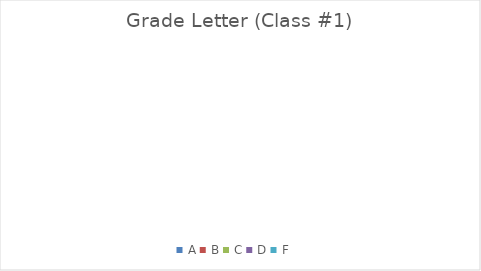
| Category | Series 0 |
|---|---|
| A | 0 |
| B | 0 |
| C | 0 |
| D | 0 |
| F | 0 |